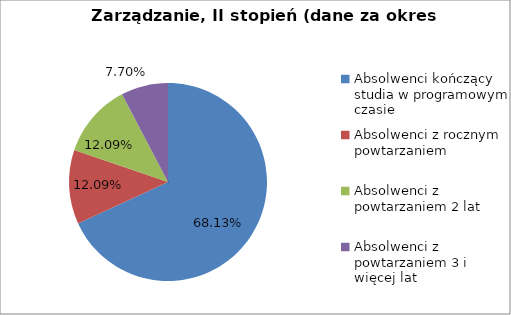
| Category | Series 0 |
|---|---|
| Absolwenci kończący studia w programowym czasie | 68.132 |
| Absolwenci z rocznym powtarzaniem | 12.088 |
| Absolwenci z powtarzaniem 2 lat | 12.088 |
| Absolwenci z powtarzaniem 3 i więcej lat | 7.692 |